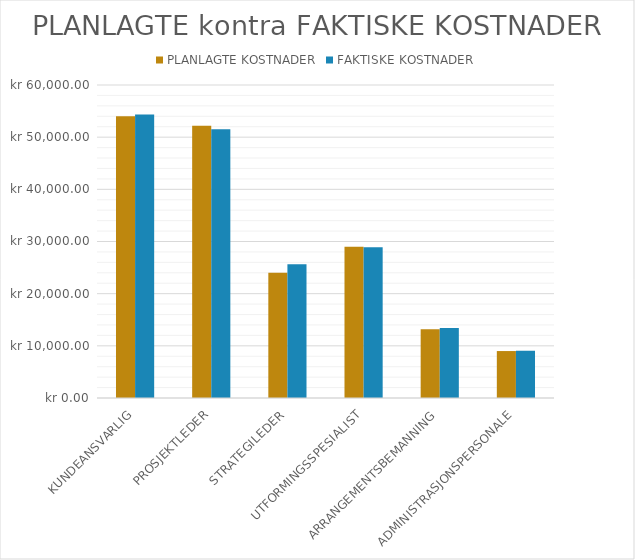
| Category | PLANLAGTE KOSTNADER | FAKTISKE KOSTNADER |
|---|---|---|
| KUNDEANSVARLIG | 54000 | 54360 |
| PROSJEKTLEDER | 52200 | 51540 |
| STRATEGILEDER | 24000 | 25650 |
| UTFORMINGSSPESIALIST | 29000 | 28900 |
| ARRANGEMENTSBEMANNING | 13200 | 13400 |
| ADMINISTRASJONSPERSONALE | 9000 | 9060 |